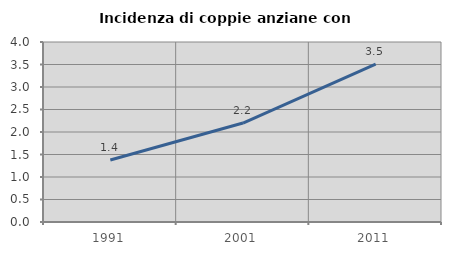
| Category | Incidenza di coppie anziane con figli |
|---|---|
| 1991.0 | 1.377 |
| 2001.0 | 2.199 |
| 2011.0 | 3.507 |